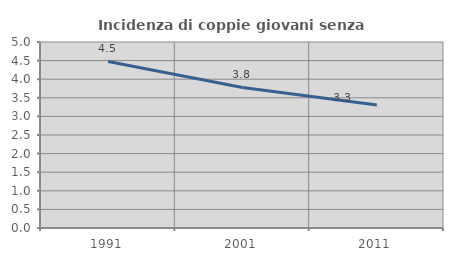
| Category | Incidenza di coppie giovani senza figli |
|---|---|
| 1991.0 | 4.478 |
| 2001.0 | 3.779 |
| 2011.0 | 3.308 |